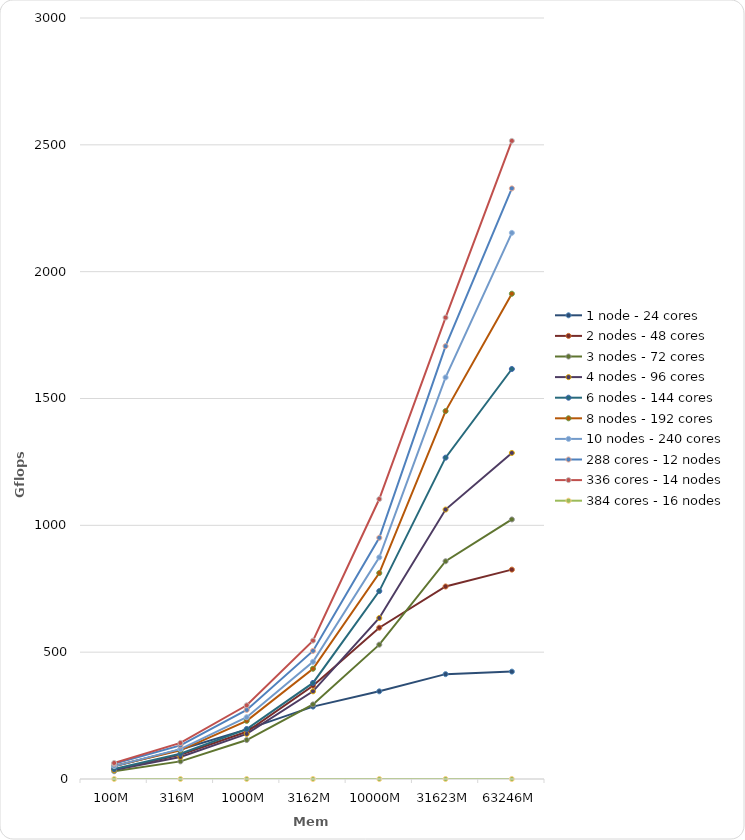
| Category | 1 node - 24 cores | 2 nodes - 48 cores | 3 nodes - 72 cores  | 4 nodes - 96 cores | 6 nodes - 144 cores | 8 nodes - 192 cores | 10 nodes - 240 cores | 288 cores - 12 nodes | 336 cores - 14 nodes | 384 cores - 16 nodes |
|---|---|---|---|---|---|---|---|---|---|---|
| 100M | 49.662 | 37 | 30.6 | 35.6 | 39.6 | 51.15 | 50.82 | 60.053 | 63.244 |  |
| 316M | 116.234 | 95.4 | 69.5 | 87 | 99.3 | 113 | 117.6 | 132.629 | 142.171 |  |
| 1000M | 195.749 | 186.1 | 153.7 | 177.8 | 196.7 | 229.2 | 243.4 | 272.43 | 290.598 |  |
| 3162M | 285.341 | 367.7 | 294 | 345.6 | 378.8 | 434.7 | 462 | 505.051 | 545.538 |  |
| 10000M | 345.592 | 596.4 | 529.6 | 634.7 | 740.8 | 811.9 | 873.8 | 950.984 | 1103.63 |  |
| 31623M | 413.337 | 758.9 | 858.4 | 1062.2 | 1266.8 | 1450.4 | 1583.11 | 1706.32 | 1818.99 |  |
| 63246M | 423.335 | 825.4 | 1023.2 | 1285.3 | 1616.3 | 1913 | 2152.93 | 2328.3 | 2515.64 |  |